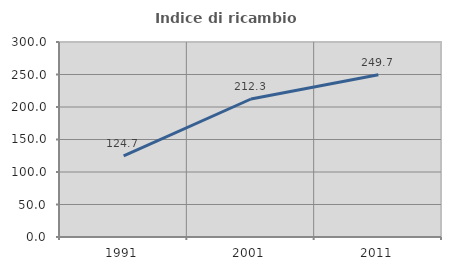
| Category | Indice di ricambio occupazionale  |
|---|---|
| 1991.0 | 124.712 |
| 2001.0 | 212.302 |
| 2011.0 | 249.732 |